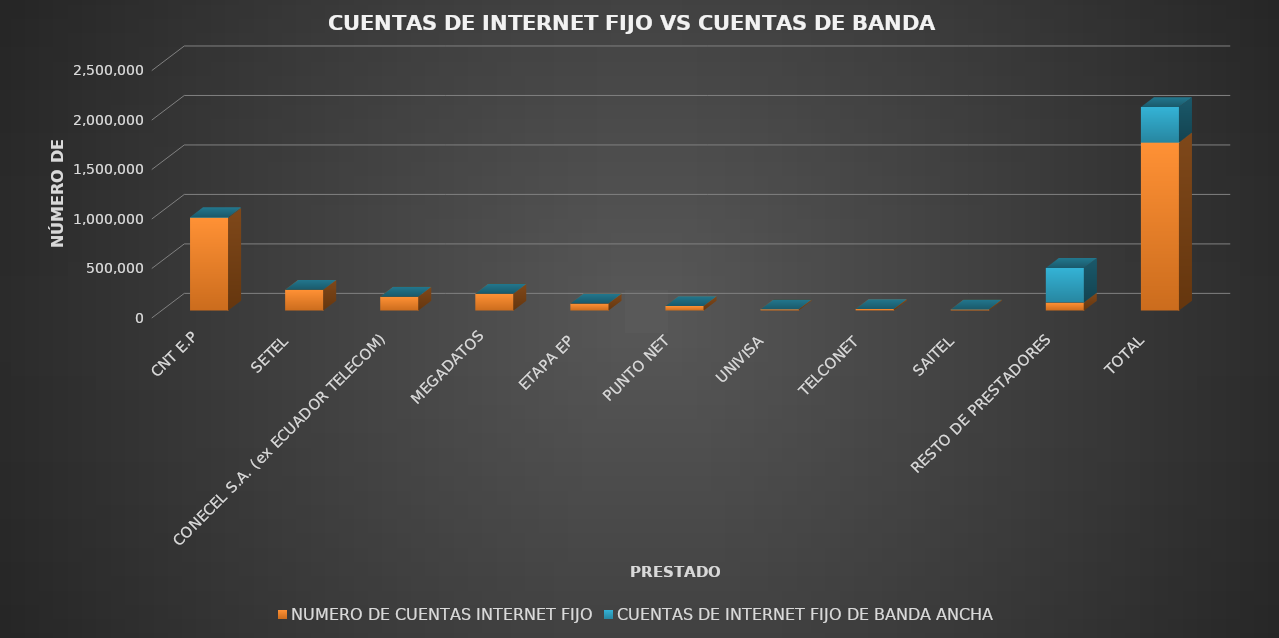
| Category | NUMERO DE CUENTAS INTERNET FIJO | CUENTAS DE INTERNET FIJO DE BANDA ANCHA |
|---|---|---|
| CNT E.P | 937219 | 6726 |
| SETEL | 210742 | 0 |
| CONECEL S.A. (ex ECUADOR TELECOM) | 140540 | 1 |
| MEGADATOS | 171456 | 0 |
| ETAPA EP | 71179 | 0 |
| PUNTO NET | 46890 | 15 |
| UNIVISA | 12601 | 0 |
| TELCONET | 16245 | 0 |
| SAITEL | 12117 | 33 |
| RESTO DE PRESTADORES | 81118 | 350215 |
| TOTAL | 1700107 | 356990 |